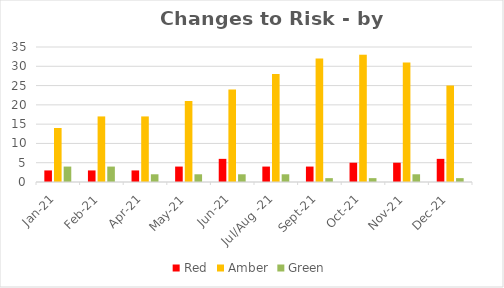
| Category | Red | Amber | Green |
|---|---|---|---|
| Jan-21 | 3 | 14 | 4 |
| Feb-21 | 3 | 17 | 4 |
| Apr-21 | 3 | 17 | 2 |
| May-21 | 4 | 21 | 2 |
| Jun-21 | 6 | 24 | 2 |
| Jul/Aug -21 | 4 | 28 | 2 |
| Sep-21 | 4 | 32 | 1 |
| Oct-21 | 5 | 33 | 1 |
| Nov-21 | 5 | 31 | 2 |
| Dec-21 | 6 | 25 | 1 |